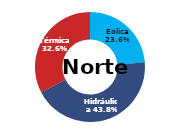
| Category | Norte |
|---|---|
| Eólica | 87.433 |
| Hidráulica | 161.963 |
| Solar | 0 |
| Térmica | 120.623 |